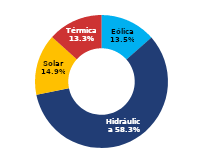
| Category | Sur |
|---|---|
| Eólica | 64.346 |
| Hidráulica | 277.222 |
| Solar | 70.789 |
| Térmica | 63.495 |